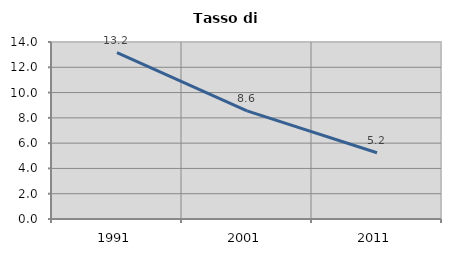
| Category | Tasso di disoccupazione   |
|---|---|
| 1991.0 | 13.164 |
| 2001.0 | 8.555 |
| 2011.0 | 5.236 |